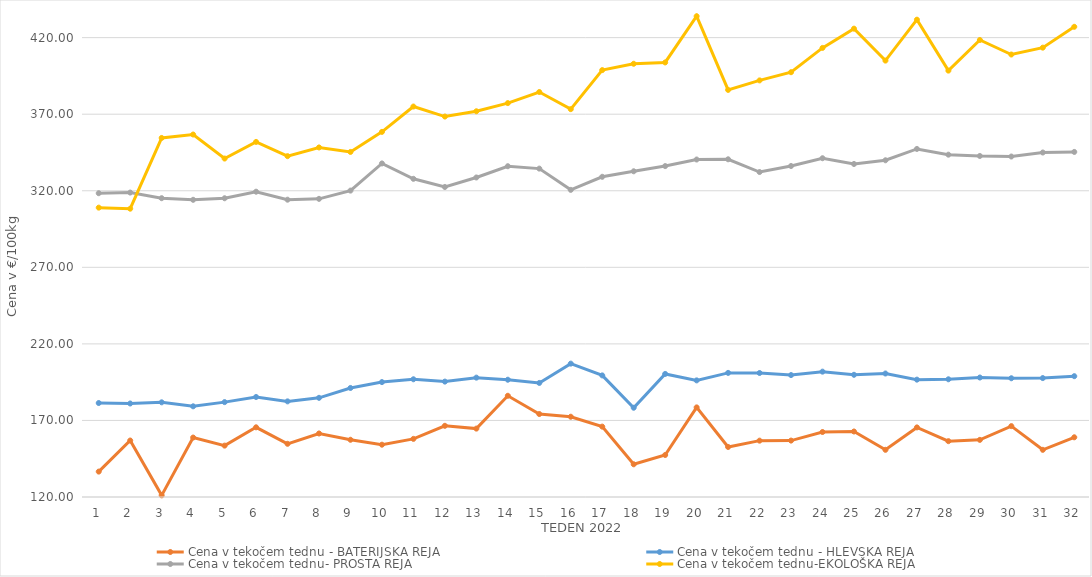
| Category | Cena v tekočem tednu - BATERIJSKA REJA | Cena v tekočem tednu - HLEVSKA REJA | Cena v tekočem tednu- PROSTA REJA | Cena v tekočem tednu-EKOLOŠKA REJA |
|---|---|---|---|---|
| 1.0 | 136.59 | 181.38 | 318.4 | 308.97 |
| 2.0 | 156.88 | 181.07 | 318.82 | 308.28 |
| 3.0 | 121.07 | 181.83 | 315.14 | 354.48 |
| 4.0 | 158.82 | 179.22 | 314.08 | 356.72 |
| 5.0 | 153.55 | 181.96 | 315.1 | 341.03 |
| 6.0 | 165.51 | 185.31 | 319.38 | 351.9 |
| 7.0 | 154.74 | 182.45 | 314.16 | 342.59 |
| 8.0 | 161.48 | 184.77 | 314.71 | 348.28 |
| 9.0 | 157.38 | 191.21 | 320.1 | 345.35 |
| 10.0 | 154.16 | 195.04 | 337.83 | 358.45 |
| 11.0 | 157.96 | 196.88 | 327.79 | 375 |
| 12.0 | 166.49 | 195.36 | 322.46 | 368.45 |
| 13.0 | 164.66 | 197.95 | 328.67 | 371.9 |
| 14.0 | 186.11 | 196.59 | 336.02 | 377.24 |
| 15.0 | 174.18 | 194.49 | 334.46 | 384.48 |
| 16.0 | 172.42 | 207.1 | 320.58 | 373.28 |
| 17.0 | 165.96 | 199.41 | 329.11 | 398.79 |
| 18.0 | 141.36 | 178.29 | 332.71 | 402.93 |
| 19.0 | 147.43 | 200.37 | 336.11 | 403.79 |
| 20.0 | 178.51 | 196.16 | 340.4 | 433.97 |
| 21.0 | 152.67 | 201.05 | 340.55 | 385.86 |
| 22.0 | 156.8 | 200.98 | 332.23 | 392.07 |
| 23.0 | 156.84 | 199.63 | 336.16 | 397.41 |
| 24.0 | 162.44 | 201.86 | 341.24 | 413.28 |
| 25.0 | 162.78 | 199.81 | 337.48 | 425.86 |
| 26.0 | 150.82 | 200.65 | 339.9 | 405 |
| 27.0 | 165.45 | 196.64 | 347.3 | 431.72 |
| 28.0 | 156.46 | 196.88 | 343.56 | 398.45 |
| 29.0 | 157.31 | 198.03 | 342.71 | 418.45 |
| 30.0 | 166.29 | 197.55 | 342.35 | 408.97 |
| 31.0 | 150.81 | 197.66 | 344.97 | 413.45 |
| 32.0 | 158.99 | 198.9 | 345.35 | 427.07 |